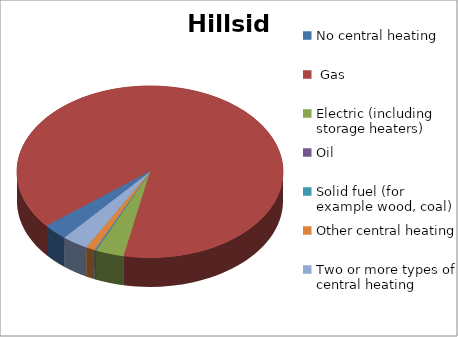
| Category | Hillside |
|---|---|
| No central heating | 53 |
|  Gas | 1584 |
| Electric (including storage heaters) | 61 |
| Oil | 1 |
| Solid fuel (for example wood, coal) | 3 |
| Other central heating | 19 |
| Two or more types of central heating | 57 |